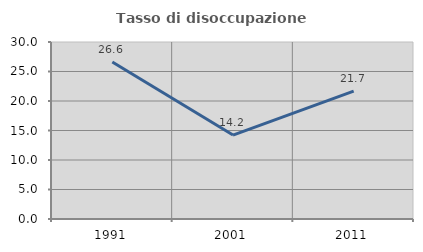
| Category | Tasso di disoccupazione giovanile  |
|---|---|
| 1991.0 | 26.606 |
| 2001.0 | 14.228 |
| 2011.0 | 21.687 |